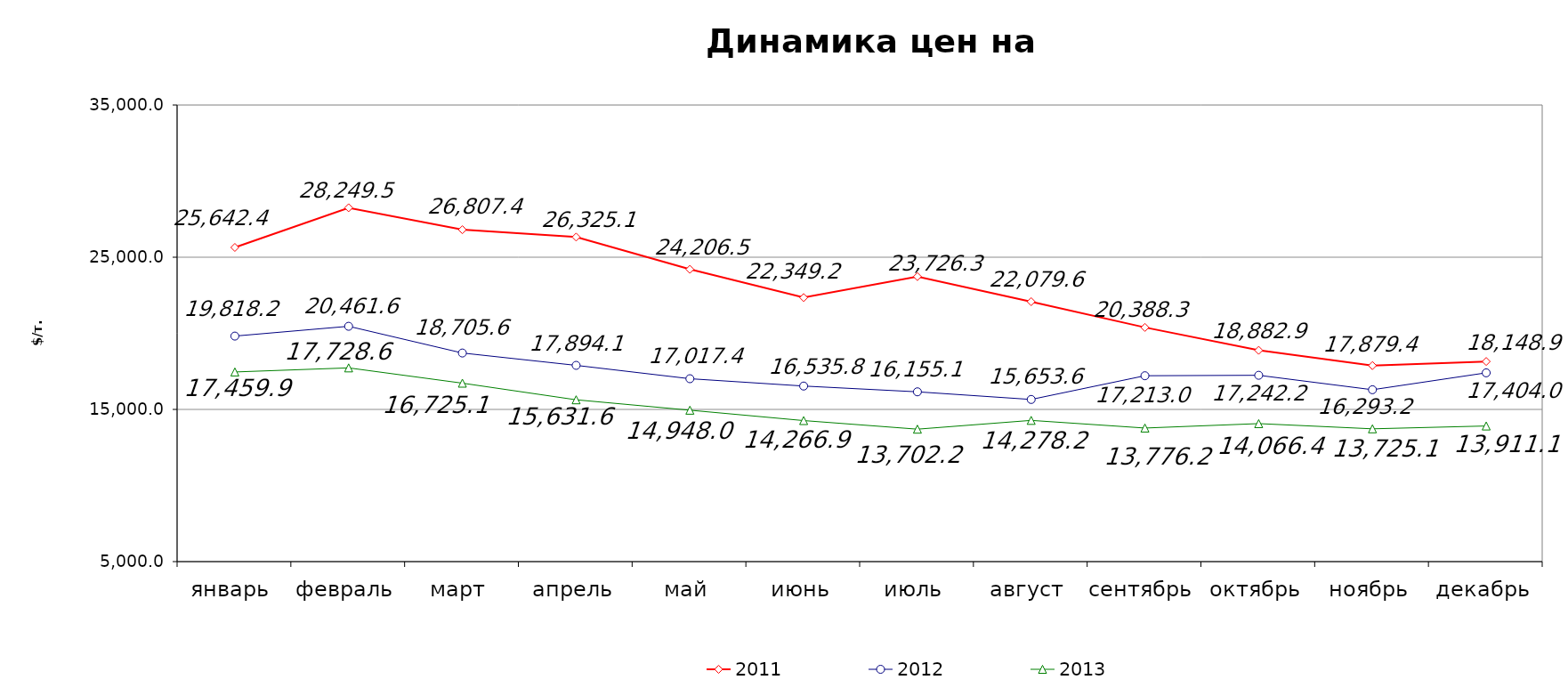
| Category | 2011 | 2012 | 2013 |
|---|---|---|---|
| январь | 25642.38 | 19818.21 | 17459.886 |
| февраль | 28249.5 | 20461.55 | 17728.625 |
| март | 26807.39 | 18705.57 | 16725.13 |
| апрель | 26325.14 | 17894.079 | 15631.55 |
| май | 24206.5 | 17017.385 | 14947.98 |
| июнь | 22349.21 | 16535.79 | 14266.875 |
| июль | 23726.31 | 16155.1 | 13702.175 |
| август | 22079.55 | 15653.639 | 14278.22 |
| сентябрь | 20388.3 | 17213 | 13776.19 |
| октябрь | 18882.859 | 17242.17 | 14066.41 |
| ноябрь | 17879.44 | 16293.18 | 13725.12 |
| декабрь | 18148.9 | 17403.95 | 13911.125 |